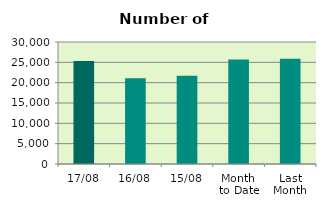
| Category | Series 0 |
|---|---|
| 17/08 | 25318 |
| 16/08 | 21060 |
| 15/08 | 21684 |
| Month 
to Date | 25722 |
| Last
Month | 25883.727 |